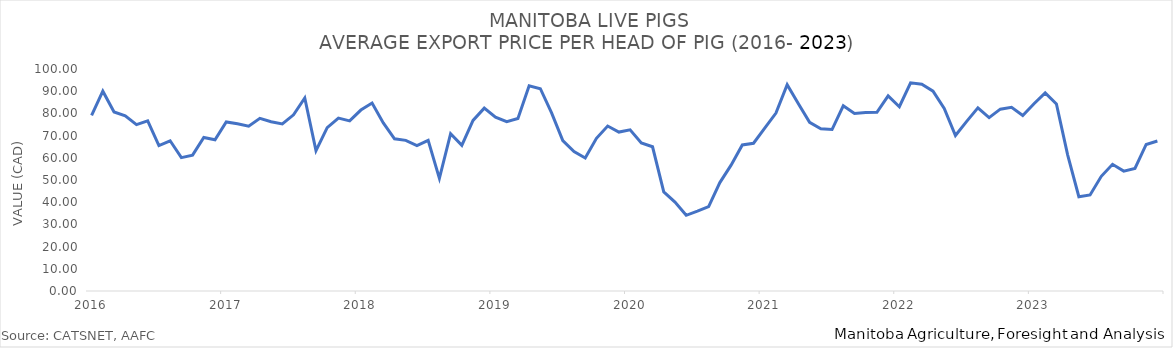
| Category | Total Pig P |
|---|---|
| 2016-01-01 | 79.131 |
| 2016-02-01 | 90.004 |
| 2016-03-01 | 80.662 |
| 2016-04-01 | 78.876 |
| 2016-05-01 | 74.947 |
| 2016-06-01 | 76.645 |
| 2016-07-01 | 65.49 |
| 2016-08-01 | 67.667 |
| 2016-09-01 | 60.058 |
| 2016-10-01 | 61.189 |
| 2016-11-01 | 69.171 |
| 2016-12-01 | 68.091 |
| 2017-01-01 | 76.147 |
| 2017-02-01 | 75.296 |
| 2017-03-01 | 74.253 |
| 2017-04-01 | 77.794 |
| 2017-05-01 | 76.252 |
| 2017-06-01 | 75.282 |
| 2017-07-01 | 79.349 |
| 2017-08-01 | 86.93 |
| 2017-09-01 | 63.25 |
| 2017-10-01 | 73.587 |
| 2017-11-01 | 77.881 |
| 2017-12-01 | 76.648 |
| 2018-01-01 | 81.507 |
| 2018-02-01 | 84.641 |
| 2018-03-01 | 75.733 |
| 2018-04-01 | 68.57 |
| 2018-05-01 | 67.862 |
| 2018-06-01 | 65.481 |
| 2018-07-01 | 67.852 |
| 2018-08-01 | 50.722 |
| 2018-09-01 | 70.863 |
| 2018-10-01 | 65.635 |
| 2018-11-01 | 76.82 |
| 2018-12-01 | 82.357 |
| 2019-01-01 | 78.308 |
| 2019-02-01 | 76.318 |
| 2019-03-01 | 77.68 |
| 2019-04-01 | 92.463 |
| 2019-05-01 | 91.121 |
| 2019-06-01 | 80.252 |
| 2019-07-01 | 67.724 |
| 2019-08-01 | 62.779 |
| 2019-09-01 | 59.91 |
| 2019-10-01 | 68.79 |
| 2019-11-01 | 74.311 |
| 2019-12-01 | 71.585 |
| 2020-01-01 | 72.584 |
| 2020-02-01 | 66.659 |
| 2020-03-01 | 64.964 |
| 2020-04-01 | 44.652 |
| 2020-05-01 | 40.063 |
| 2020-06-01 | 34.105 |
| 2020-07-01 | 35.98 |
| 2020-08-01 | 38.045 |
| 2020-09-01 | 48.832 |
| 2020-10-01 | 56.701 |
| 2020-11-01 | 65.776 |
| 2020-12-01 | 66.559 |
| 2021-01-01 | 73.402 |
| 2021-02-01 | 80.136 |
| 2021-03-01 | 92.955 |
| 2021-04-01 | 84.346 |
| 2021-05-01 | 75.952 |
| 2021-06-01 | 73.07 |
| 2021-07-01 | 72.732 |
| 2021-08-01 | 83.432 |
| 2021-09-01 | 79.934 |
| 2021-10-01 | 80.365 |
| 2021-11-01 | 80.48 |
| 2021-12-01 | 87.88 |
| 2022-01-01 | 82.997 |
| 2022-02-01 | 93.775 |
| 2022-03-01 | 93.11 |
| 2022-04-01 | 90.02 |
| 2022-05-01 | 82.285 |
| 2022-06-01 | 70.046 |
| 2022-07-01 | 76.413 |
| 2022-08-01 | 82.494 |
| 2022-09-01 | 78.075 |
| 2022-10-01 | 81.912 |
| 2022-11-01 | 82.718 |
| 2022-12-01 | 79.077 |
| 2023-01-01 | 84.359 |
| 2023-02-01 | 89.219 |
| 2023-03-01 | 84.279 |
| 2023-04-01 | 61.318 |
| 2023-05-01 | 42.461 |
| 2023-06-01 | 43.258 |
| 2023-07-01 | 51.665 |
| 2023-08-01 | 57.067 |
| 2023-09-01 | 53.998 |
| 2023-10-01 | 55.18 |
| 2023-11-01 | 66.004 |
| 2023-12-01 | 67.57 |